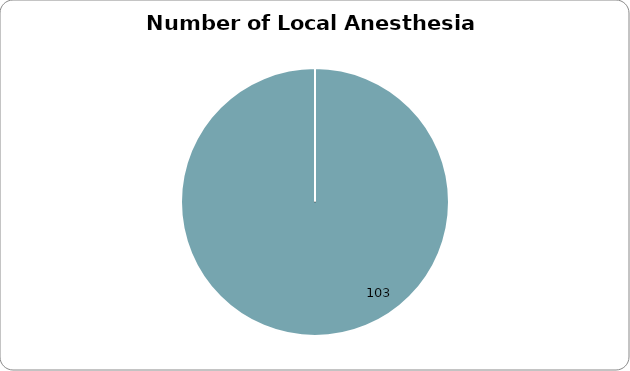
| Category | Series 0 |
|---|---|
| 0 | 103 |